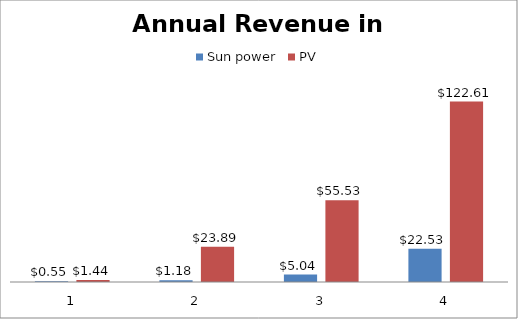
| Category | Sun power | PV |
|---|---|---|
| 0 | 0.55 | 1.44 |
| 1 | 1.18 | 23.89 |
| 2 | 5.04 | 55.53 |
| 3 | 22.53 | 122.61 |